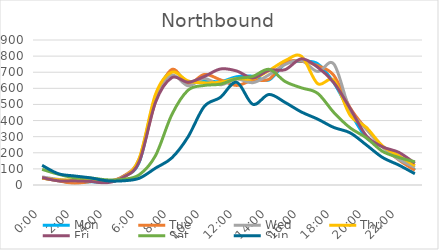
| Category | Mon | Tue | Wed | Thu | Fri | Sat | Sun |
|---|---|---|---|---|---|---|---|
| 0.0 | 44 | 43 | 50 | 42 | 46 | 97 | 122 |
| 0.041667 | 27 | 26 | 35 | 32 | 26 | 67 | 70 |
| 0.083333 | 13 | 10 | 27 | 31 | 26 | 45 | 56 |
| 0.125 | 20 | 21 | 32 | 25 | 22 | 43 | 44 |
| 0.166667 | 17 | 22 | 22 | 23 | 14 | 32 | 26 |
| 0.208333 | 53 | 54 | 48 | 45 | 47 | 35 | 26 |
| 0.25 | 144 | 161 | 164 | 168 | 146 | 64 | 42 |
| 0.291667 | 542 | 520 | 551 | 564 | 514 | 183 | 105 |
| 0.333333 | 708 | 717 | 682 | 700 | 666 | 436 | 168 |
| 0.375 | 634 | 627 | 616 | 646 | 638 | 588 | 298 |
| 0.416667 | 648 | 686 | 661 | 634 | 673 | 618 | 487 |
| 0.458333 | 641 | 653 | 622 | 638 | 720 | 626 | 544 |
| 0.5 | 672 | 618 | 658 | 660 | 708 | 660 | 638 |
| 0.541667 | 675 | 651 | 635 | 659 | 664 | 674 | 501 |
| 0.5833333333333334 | 652 | 656 | 684 | 711 | 712 | 718 | 562 |
| 0.625 | 753 | 762 | 748 | 772 | 716 | 642 | 512 |
| 0.666667 | 767 | 768 | 773 | 799 | 783 | 603 | 453 |
| 0.708333 | 753 | 741 | 704 | 629 | 731 | 569 | 409 |
| 0.75 | 634 | 680 | 751 | 650 | 635 | 450 | 357 |
| 0.791667 | 453 | 480 | 465 | 433 | 476 | 355 | 324 |
| 0.833333 | 294 | 348 | 348 | 358 | 306 | 293 | 249 |
| 0.875 | 239 | 240 | 236 | 242 | 237 | 209 | 171 |
| 0.916667 | 172 | 156 | 159 | 182 | 203 | 171 | 124 |
| 0.958333 | 93 | 91 | 110 | 120 | 135 | 144 | 70 |